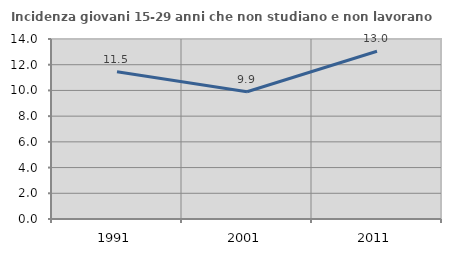
| Category | Incidenza giovani 15-29 anni che non studiano e non lavorano  |
|---|---|
| 1991.0 | 11.456 |
| 2001.0 | 9.901 |
| 2011.0 | 13.043 |